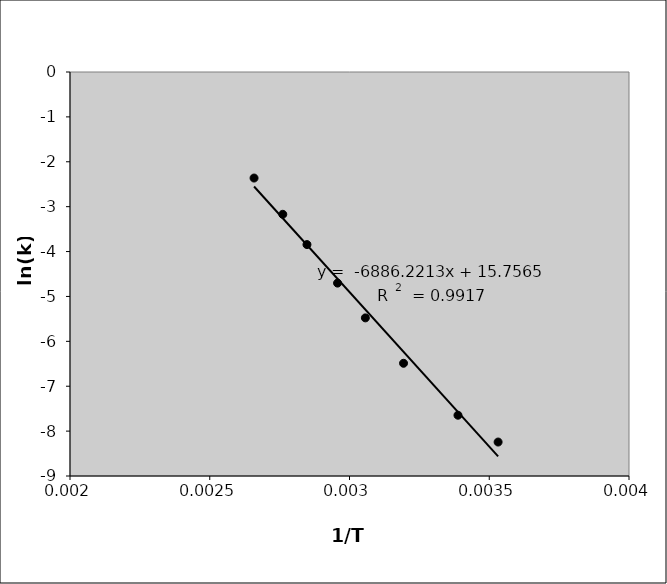
| Category | Series 0 |
|---|---|
| 0.00353169698039908 | -8.243 |
| 0.00338810774182619 | -7.646 |
| 0.00319335781574325 | -6.489 |
| 0.00305670181873758 | -5.477 |
| 0.002957267484844 | -4.703 |
| 0.00284778584650434 | -3.844 |
| 0.00276128675962999 | -3.17 |
| 0.00265851389073508 | -2.362 |